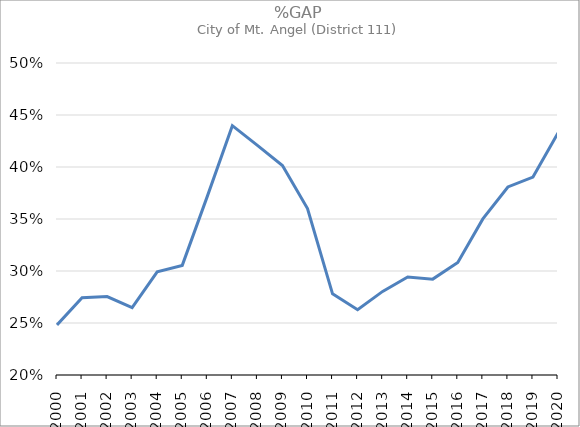
| Category | Series 0 |
|---|---|
| 2000.0 | 0.248 |
| 2001.0 | 0.274 |
| 2002.0 | 0.275 |
| 2003.0 | 0.265 |
| 2004.0 | 0.299 |
| 2005.0 | 0.305 |
| 2006.0 | 0.372 |
| 2007.0 | 0.44 |
| 2008.0 | 0.421 |
| 2009.0 | 0.401 |
| 2010.0 | 0.36 |
| 2011.0 | 0.278 |
| 2012.0 | 0.263 |
| 2013.0 | 0.28 |
| 2014.0 | 0.294 |
| 2015.0 | 0.292 |
| 2016.0 | 0.308 |
| 2017.0 | 0.35 |
| 2018.0 | 0.381 |
| 2019.0 | 0.39 |
| 2020.0 | 0.433 |